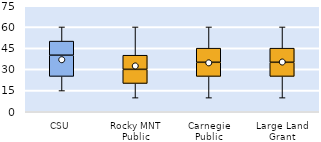
| Category | 25th | 50th | 75th |
|---|---|---|---|
| CSU | 25 | 15 | 10 |
| Rocky MNT Public | 20 | 10 | 10 |
| Carnegie Public | 25 | 10 | 10 |
| Large Land Grant | 25 | 10 | 10 |